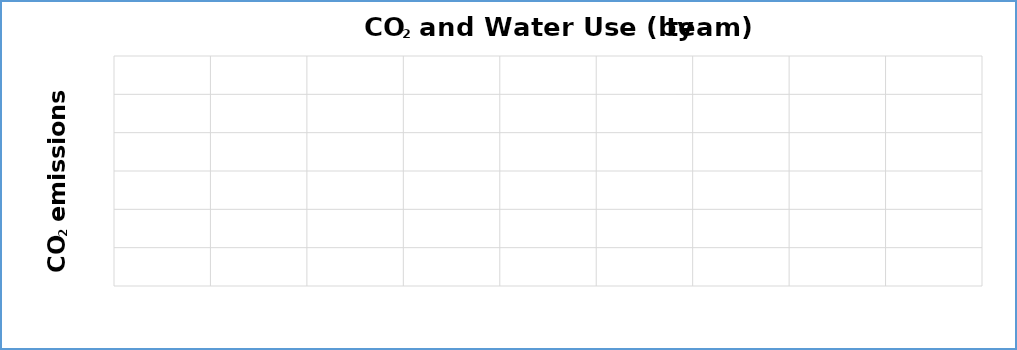
| Category | Water use |
|---|---|
| 0 | 0 |
| 1 | 0 |
| 2 | 0 |
| 3 | 0 |
| 4 | 0 |
| 5 | 0 |
| 6 | 0 |
| 7 | 0 |